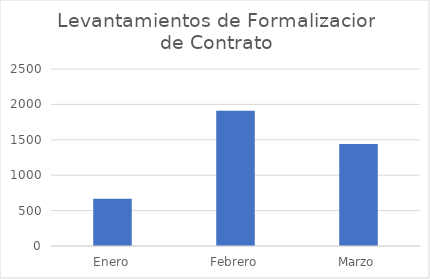
| Category | Levantamientos de Formalizacion de Contrato |
|---|---|
| Enero | 669 |
| Febrero | 1910 |
| Marzo | 1442 |